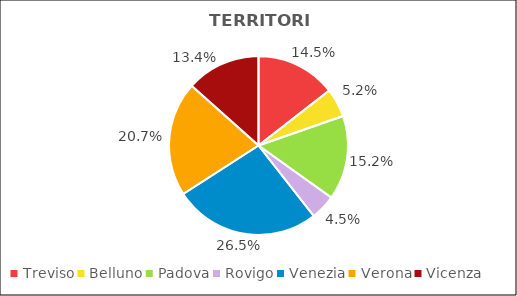
| Category | Series 0 |
|---|---|
| Treviso | 7396 |
| Belluno | 2650 |
| Padova | 7770 |
| Rovigo | 2324 |
| Venezia | 13518 |
| Verona | 10581 |
| Vicenza | 6843 |